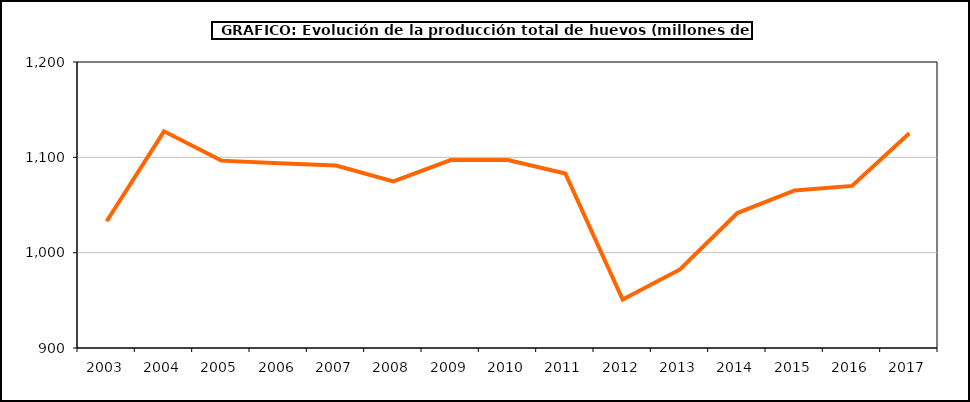
| Category | huevos |
|---|---|
| 2003.0 | 1033 |
| 2004.0 | 1127.271 |
| 2005.0 | 1096.54 |
| 2006.0 | 1093.721 |
| 2007.0 | 1091.465 |
| 2008.0 | 1074.834 |
| 2009.0 | 1097.178 |
| 2010.0 | 1097.2 |
| 2011.0 | 1083.082 |
| 2012.0 | 950.879 |
| 2013.0 | 982.375 |
| 2014.0 | 1041.522 |
| 2015.0 | 1065.202 |
| 2016.0 | 1070 |
| 2017.0 | 1125.287 |